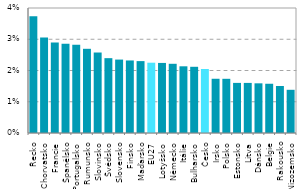
| Category | Series 0 |
|---|---|
| Řecko | 0.037 |
| Chorvatsko | 0.031 |
| Francie | 0.029 |
| Španělsko | 0.029 |
| Portugalsko | 0.028 |
| Rumunsko | 0.027 |
| Slovinsko | 0.026 |
| Švédsko | 0.024 |
| Slovensko | 0.023 |
| Finsko | 0.023 |
| Maďarsko | 0.023 |
| EU27 | 0.022 |
| Lotyšsko | 0.022 |
| Německo | 0.022 |
| Itálie | 0.021 |
| Bulharsko | 0.021 |
| Česko | 0.02 |
| Irsko | 0.017 |
| Polsko | 0.017 |
| Estonsko | 0.016 |
| Litva | 0.016 |
| Dánsko | 0.016 |
| Belgie | 0.016 |
| Rakousko | 0.015 |
| Nizozemsko | 0.014 |